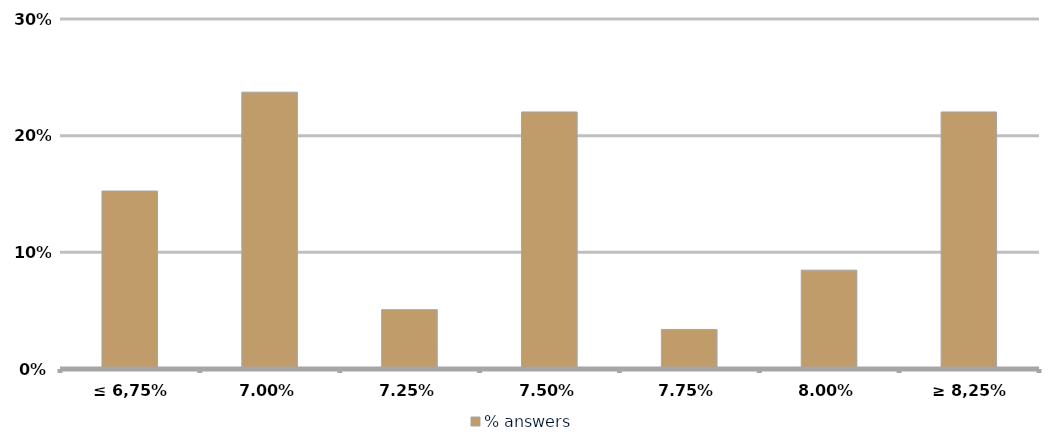
| Category | % answers |
|---|---|
| ≤ 6,75% | 0.153 |
| 7,00% | 0.237 |
| 7,25% | 0.051 |
| 7,50% | 0.22 |
| 7,75% | 0.034 |
| 8,00% | 0.085 |
| ≥ 8,25% | 0.22 |